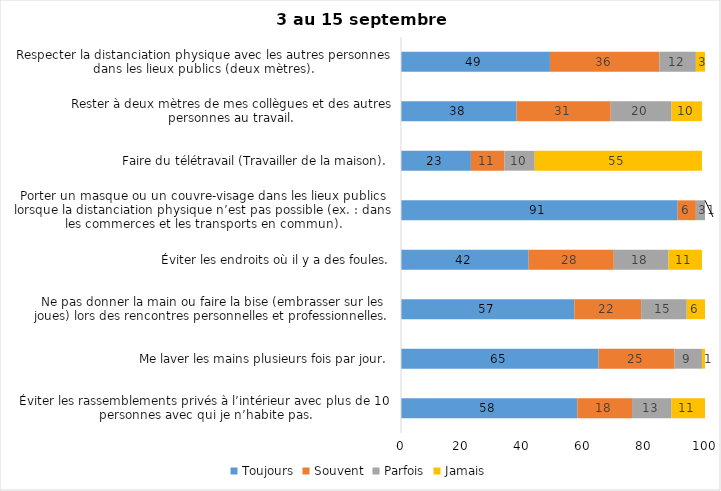
| Category | Toujours | Souvent | Parfois | Jamais |
|---|---|---|---|---|
| Éviter les rassemblements privés à l’intérieur avec plus de 10 personnes avec qui je n’habite pas. | 58 | 18 | 13 | 11 |
| Me laver les mains plusieurs fois par jour. | 65 | 25 | 9 | 1 |
| Ne pas donner la main ou faire la bise (embrasser sur les joues) lors des rencontres personnelles et professionnelles. | 57 | 22 | 15 | 6 |
| Éviter les endroits où il y a des foules. | 42 | 28 | 18 | 11 |
| Porter un masque ou un couvre-visage dans les lieux publics lorsque la distanciation physique n’est pas possible (ex. : dans les commerces et les transports en commun). | 91 | 6 | 3 | 1 |
| Faire du télétravail (Travailler de la maison). | 23 | 11 | 10 | 55 |
| Rester à deux mètres de mes collègues et des autres personnes au travail. | 38 | 31 | 20 | 10 |
| Respecter la distanciation physique avec les autres personnes dans les lieux publics (deux mètres). | 49 | 36 | 12 | 3 |